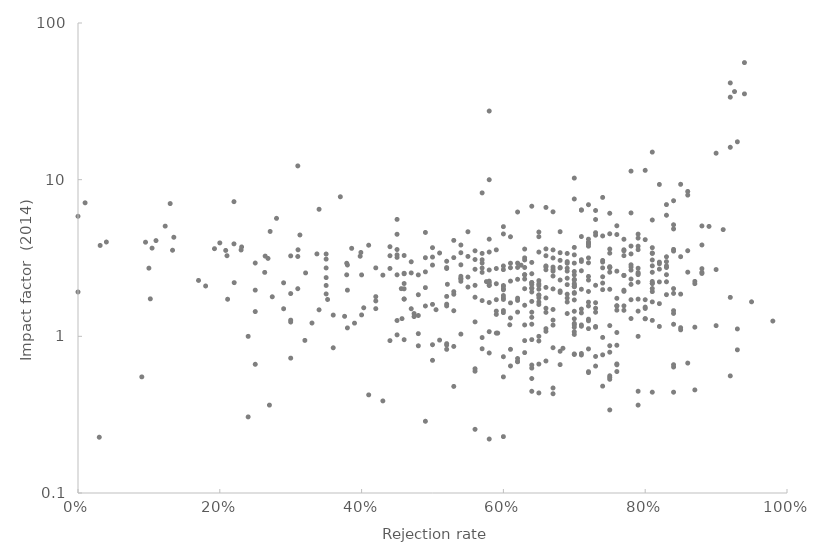
| Category | Series 0 |
|---|---|
| 0.98 | 1.252 |
| 0.95 | 1.661 |
| 0.94 | 35.289 |
| 0.94 | 55.873 |
| 0.93 | 0.82 |
| 0.93 | 17.445 |
| 0.93 | 1.115 |
| 0.926 | 36.503 |
| 0.92 | 1.773 |
| 0.92 | 41.456 |
| 0.92 | 16.095 |
| 0.92 | 33.611 |
| 0.92 | 0.559 |
| 0.91 | 4.799 |
| 0.9 | 2.668 |
| 0.9 | 1.17 |
| 0.9 | 14.756 |
| 0.89 | 5.031 |
| 0.88 | 5.064 |
| 0.88 | 2.704 |
| 0.88 | 3.829 |
| 0.88 | 2.561 |
| 0.88 | 2.519 |
| 0.87 | 1.144 |
| 0.87 | 2.243 |
| 0.87 | 0.455 |
| 0.87 | 2.169 |
| 0.86 | 2.568 |
| 0.86 | 8.41 |
| 0.86 | 3.518 |
| 0.86 | 0.675 |
| 0.86 | 7.972 |
| 0.85 | 1.1 |
| 0.85 | 1.135 |
| 0.85 | 1.86 |
| 0.85 | 9.343 |
| 0.85 | 3.224 |
| 0.84 | 1.4 |
| 0.84 | 4.847 |
| 0.84 | 2.017 |
| 0.84 | 3.59 |
| 0.84 | 0.659 |
| 0.84 | 1.194 |
| 0.84 | 5.153 |
| 0.84 | 0.44 |
| 0.84 | 3.501 |
| 0.84 | 7.338 |
| 0.84 | 1.458 |
| 0.84 | 1.879 |
| 0.84 | 0.637 |
| 0.83 | 6.932 |
| 0.83 | 2.815 |
| 0.83 | 2.749 |
| 0.83 | 2.998 |
| 0.83 | 5.929 |
| 0.83 | 2.474 |
| 0.83 | 2.229 |
| 0.83 | 1.845 |
| 0.83 | 3.22 |
| 0.82 | 1.617 |
| 0.82 | 2.906 |
| 0.82 | 2.685 |
| 0.82 | 9.322 |
| 0.82 | 2.976 |
| 0.82 | 2.225 |
| 0.82 | 1.156 |
| 0.81 | 3.402 |
| 0.81 | 1.264 |
| 0.81 | 2.172 |
| 0.81 | 3.071 |
| 0.81 | 1.929 |
| 0.81 | 3.383 |
| 0.81 | 1.659 |
| 0.81 | 2.818 |
| 0.81 | 3.681 |
| 0.81 | 0.44 |
| 0.81 | 2.02 |
| 0.81 | 15 |
| 0.81 | 2.24 |
| 0.81 | 2.564 |
| 0.81 | 2.182 |
| 0.81 | 5.528 |
| 0.8 | 1.713 |
| 0.8 | 4.141 |
| 0.8 | 1.537 |
| 0.8 | 1.297 |
| 0.8 | 1.506 |
| 0.8 | 11.47 |
| 0.8 | 1.293 |
| 0.79 | 3.762 |
| 0.79 | 4.494 |
| 0.79 | 1.448 |
| 0.79 | 1.728 |
| 0.79 | 2.72 |
| 0.79 | 0.364 |
| 0.79 | 1 |
| 0.79 | 0.446 |
| 0.79 | 2.475 |
| 0.79 | 3.574 |
| 0.79 | 4.237 |
| 0.79 | 2.216 |
| 0.79 | 2.515 |
| 0.79 | 2.554 |
| 0.78 | 2.145 |
| 0.78 | 3.769 |
| 0.78 | 2.322 |
| 0.78 | 1.299 |
| 0.78 | 3.358 |
| 0.78 | 2.862 |
| 0.78 | 1.713 |
| 0.78 | 2.771 |
| 0.78 | 11.336 |
| 0.78 | 6.135 |
| 0.78 | 2.646 |
| 0.77 | 1.97 |
| 0.77 | 1.466 |
| 0.77 | 3.273 |
| 0.77 | 2.451 |
| 0.77 | 1.565 |
| 0.77 | 3.568 |
| 0.77 | 3.512 |
| 0.77 | 2.444 |
| 0.77 | 4.165 |
| 0.77 | 1.936 |
| 0.76 | 4.465 |
| 0.76 | 0.596 |
| 0.76 | 1.562 |
| 0.76 | 0.877 |
| 0.76 | 1.749 |
| 0.76 | 2.606 |
| 0.76 | 1.058 |
| 0.76 | 1.568 |
| 0.76 | 0.658 |
| 0.76 | 5.078 |
| 0.76 | 1.469 |
| 0.76 | 0.667 |
| 0.75 | 6.1 |
| 0.75 | 0.532 |
| 0.75 | 4.513 |
| 0.75 | 1.997 |
| 0.75 | 0.871 |
| 0.75 | 3.395 |
| 0.75 | 2.786 |
| 0.75 | 0.339 |
| 0.75 | 0.792 |
| 0.75 | 1.171 |
| 0.75 | 2.567 |
| 0.75 | 3.607 |
| 0.75 | 0.546 |
| 0.75 | 2.751 |
| 0.75 | 0.56 |
| 0.75 | 2.747 |
| 0.74 | 0.984 |
| 0.74 | 2.4 |
| 0.74 | 4.373 |
| 0.74 | 1.986 |
| 0.74 | 0.481 |
| 0.74 | 3.051 |
| 0.74 | 7.705 |
| 0.74 | 2.979 |
| 0.74 | 2.736 |
| 0.74 | 0.762 |
| 0.74 | 2.188 |
| 0.73 | 0.744 |
| 0.73 | 0.646 |
| 0.73 | 1.639 |
| 0.73 | 4.422 |
| 0.73 | 4.59 |
| 0.73 | 5.567 |
| 0.73 | 1.143 |
| 0.73 | 2.117 |
| 0.73 | 1.425 |
| 0.73 | 6.357 |
| 0.73 | 1.511 |
| 0.73 | 1.156 |
| 0.72 | 3.762 |
| 0.72 | 2.286 |
| 0.72 | 3.871 |
| 0.72 | 3.942 |
| 0.72 | 4.172 |
| 0.72 | 3.973 |
| 0.72 | 1.287 |
| 0.72 | 1.562 |
| 0.72 | 3.169 |
| 0.72 | 1.933 |
| 0.72 | 6.921 |
| 0.72 | 0.587 |
| 0.72 | 2.412 |
| 0.72 | 0.831 |
| 0.72 | 3.957 |
| 0.72 | 2.947 |
| 0.72 | 1.256 |
| 0.72 | 1.653 |
| 0.72 | 0.595 |
| 0.72 | 1.12 |
| 0.71 | 6.409 |
| 0.71 | 1.493 |
| 0.71 | 0.777 |
| 0.71 | 3.005 |
| 0.71 | 3.082 |
| 0.71 | 4.333 |
| 0.71 | 1.182 |
| 0.71 | 1.16 |
| 0.71 | 0.76 |
| 0.71 | 6.393 |
| 0.71 | 2.622 |
| 0.71 | 1.998 |
| 0.71 | 1.411 |
| 0.7 | 1.294 |
| 0.7 | 2.467 |
| 0.7 | 3.694 |
| 0.7 | 1.445 |
| 0.7 | 2.081 |
| 0.7 | 1.209 |
| 0.7 | 0.766 |
| 0.7 | 2.171 |
| 0.7 | 1.182 |
| 0.7 | 2.072 |
| 0.7 | 1.88 |
| 0.7 | 2.284 |
| 0.7 | 2.131 |
| 0.7 | 1.07 |
| 0.7 | 2.594 |
| 0.7 | 0.772 |
| 0.7 | 3.312 |
| 0.7 | 1.142 |
| 0.7 | 2.933 |
| 0.7 | 1.028 |
| 0.7 | 10.235 |
| 0.7 | 7.528 |
| 0.7 | 1.707 |
| 0.7 | 2.308 |
| 0.7 | 1.903 |
| 0.69 | 2.929 |
| 0.69 | 1.656 |
| 0.69 | 2.138 |
| 0.69 | 3.381 |
| 0.69 | 2.999 |
| 0.69 | 2.722 |
| 0.69 | 2.609 |
| 0.69 | 2.349 |
| 0.69 | 1.398 |
| 0.69 | 1.755 |
| 0.69 | 1.858 |
| 0.684 | 0.839 |
| 0.68 | 2.752 |
| 0.68 | 0.66 |
| 0.68 | 1.948 |
| 0.68 | 1.906 |
| 0.68 | 3.419 |
| 0.68 | 2.729 |
| 0.68 | 4.655 |
| 0.68 | 2.288 |
| 0.68 | 3.054 |
| 0.68 | 0.803 |
| 0.67 | 2.007 |
| 0.67 | 0.846 |
| 0.67 | 2.605 |
| 0.67 | 1.269 |
| 0.67 | 6.235 |
| 0.67 | 1.179 |
| 0.67 | 1.484 |
| 0.67 | 0.43 |
| 0.67 | 2.676 |
| 0.67 | 3.562 |
| 0.67 | 3.163 |
| 0.67 | 2.426 |
| 0.67 | 2.768 |
| 0.67 | 0.468 |
| 0.66 | 1.511 |
| 0.66 | 1.076 |
| 0.66 | 0.696 |
| 0.66 | 2.66 |
| 0.66 | 2.772 |
| 0.66 | 3.615 |
| 0.66 | 2.815 |
| 0.66 | 3.269 |
| 0.66 | 1.422 |
| 0.66 | 1.119 |
| 0.66 | 2.053 |
| 0.66 | 6.65 |
| 0.66 | 1.759 |
| 0.65 | 1.657 |
| 0.65 | 2.268 |
| 0.65 | 3.451 |
| 0.65 | 2 |
| 0.65 | 1.761 |
| 0.65 | 4.325 |
| 0.65 | 0.435 |
| 0.65 | 4.632 |
| 0.65 | 0.665 |
| 0.65 | 1 |
| 0.65 | 2.164 |
| 0.65 | 1.83 |
| 0.65 | 0.934 |
| 0.65 | 1.597 |
| 0.65 | 1.838 |
| 0.65 | 2.109 |
| 0.64 | 2.203 |
| 0.64 | 2.963 |
| 0.64 | 2.032 |
| 0.64 | 0.446 |
| 0.64 | 1.919 |
| 0.64 | 2.14 |
| 0.64 | 0.953 |
| 0.64 | 1.195 |
| 0.64 | 2.027 |
| 0.64 | 2.204 |
| 0.64 | 1.322 |
| 0.64 | 1.425 |
| 0.64 | 0.538 |
| 0.64 | 6.767 |
| 0.64 | 2.509 |
| 0.64 | 0.656 |
| 0.64 | 0.627 |
| 0.64 | 1.67 |
| 0.63 | 1.579 |
| 0.63 | 2.321 |
| 0.63 | 2.751 |
| 0.63 | 3.169 |
| 0.63 | 0.787 |
| 0.63 | 1.182 |
| 0.63 | 2.472 |
| 0.63 | 2.474 |
| 0.63 | 0.939 |
| 0.63 | 3.072 |
| 0.63 | 3.606 |
| 0.63 | 2.014 |
| 0.625 | 2.844 |
| 0.62 | 2.934 |
| 0.62 | 2.752 |
| 0.62 | 0.691 |
| 0.62 | 0.688 |
| 0.62 | 2.312 |
| 0.62 | 6.217 |
| 0.62 | 1.753 |
| 0.62 | 1.695 |
| 0.62 | 0.722 |
| 0.62 | 1.428 |
| 0.61 | 1.635 |
| 0.61 | 2.929 |
| 0.61 | 1.31 |
| 0.61 | 2.741 |
| 0.61 | 0.826 |
| 0.61 | 0.647 |
| 0.61 | 2.252 |
| 0.61 | 4.321 |
| 0.609 | 1.185 |
| 0.6 | 4.504 |
| 0.6 | 2.084 |
| 0.6 | 1.759 |
| 0.6 | 0.229 |
| 0.6 | 2.666 |
| 0.6 | 2.11 |
| 0.6 | 1.821 |
| 0.6 | 5.013 |
| 0.6 | 1.981 |
| 0.6 | 2.01 |
| 0.6 | 0.741 |
| 0.6 | 1.417 |
| 0.6 | 2.813 |
| 0.6 | 1.719 |
| 0.6 | 1.461 |
| 0.6 | 0.551 |
| 0.5920000000000001 | 1.049 |
| 0.59 | 2.709 |
| 0.59 | 1.449 |
| 0.59 | 1.049 |
| 0.59 | 3.564 |
| 0.59 | 1.714 |
| 0.59 | 2.167 |
| 0.59 | 1.38 |
| 0.58 | 0.221 |
| 0.58 | 2.252 |
| 0.58 | 2.196 |
| 0.58 | 4.169 |
| 0.58 | 2.128 |
| 0.58 | 1.644 |
| 0.58 | 0.783 |
| 0.58 | 2.651 |
| 0.58 | 3.453 |
| 0.58 | 1.071 |
| 0.58 | 2.11 |
| 0.58 | 27.417 |
| 0.58 | 9.992 |
| 0.5760000000000001 | 2.236 |
| 0.57 | 0.833 |
| 0.57 | 1.691 |
| 0.57 | 3.082 |
| 0.57 | 8.235 |
| 0.57 | 3.383 |
| 0.57 | 2.729 |
| 0.57 | 2.937 |
| 0.57 | 2.561 |
| 0.57 | 0.982 |
| 0.56 | 0.621 |
| 0.56 | 0.255 |
| 0.56 | 1.777 |
| 0.56 | 0.599 |
| 0.56 | 1.237 |
| 0.56 | 2.116 |
| 0.56 | 3.092 |
| 0.56 | 3.516 |
| 0.56 | 2.679 |
| 0.55 | 2.063 |
| 0.55 | 2.39 |
| 0.55 | 3.236 |
| 0.55 | 4.651 |
| 0.54 | 1.033 |
| 0.54 | 2.862 |
| 0.54 | 2.344 |
| 0.54 | 3.417 |
| 0.54 | 2.416 |
| 0.54 | 3.827 |
| 0.54 | 2.245 |
| 0.54 | 2.324 |
| 0.53 | 0.862 |
| 0.53 | 1.856 |
| 0.53 | 0.479 |
| 0.53 | 1.928 |
| 0.53 | 3.18 |
| 0.53 | 4.097 |
| 0.53 | 1.457 |
| 0.521 | 2.149 |
| 0.52 | 0.879 |
| 0.52 | 3.015 |
| 0.52 | 1.563 |
| 0.52 | 2.747 |
| 0.52 | 0.898 |
| 0.52 | 2.71 |
| 0.52 | 1.605 |
| 0.52 | 0.826 |
| 0.52 | 1.798 |
| 0.51 | 0.946 |
| 0.51 | 3.404 |
| 0.505 | 1.479 |
| 0.5 | 3.206 |
| 0.5 | 1.6 |
| 0.5 | 2.85 |
| 0.5 | 0.884 |
| 0.5 | 3.681 |
| 0.5 | 0.703 |
| 0.49 | 0.287 |
| 0.49 | 1.562 |
| 0.49 | 4.604 |
| 0.49 | 2.046 |
| 0.49 | 2.58 |
| 0.49 | 3.176 |
| 0.48 | 1.358 |
| 0.48 | 1.04 |
| 0.48 | 0.87 |
| 0.48 | 2.467 |
| 0.48 | 1.843 |
| 0.474 | 1.398 |
| 0.474 | 1.337 |
| 0.47 | 2.991 |
| 0.47 | 2.54 |
| 0.47 | 1.5 |
| 0.46 | 3.281 |
| 0.46 | 1.727 |
| 0.46 | 2.508 |
| 0.46 | 2.173 |
| 0.46 | 2.526 |
| 0.46 | 0.952 |
| 0.46 | 1.732 |
| 0.46 | 2.011 |
| 0.457 | 1.297 |
| 0.456 | 2.015 |
| 0.45 | 1.022 |
| 0.45 | 2.47 |
| 0.45 | 3.191 |
| 0.45 | 3.313 |
| 0.45 | 4.482 |
| 0.45 | 3.582 |
| 0.45 | 5.578 |
| 0.45 | 1.262 |
| 0.44 | 0.939 |
| 0.44 | 2.712 |
| 0.44 | 3.733 |
| 0.44 | 3.27 |
| 0.43 | 2.458 |
| 0.43 | 0.387 |
| 0.42 | 1.502 |
| 0.42 | 1.683 |
| 0.42 | 2.735 |
| 0.42 | 1.792 |
| 0.41 | 0.423 |
| 0.41 | 3.816 |
| 0.40299999999999997 | 1.521 |
| 0.4 | 1.37 |
| 0.4 | 2.467 |
| 0.39899999999999997 | 3.43 |
| 0.39799999999999996 | 3.246 |
| 0.39 | 1.214 |
| 0.386 | 3.645 |
| 0.38 | 1.132 |
| 0.38 | 2.853 |
| 0.38 | 1.971 |
| 0.379 | 2.47 |
| 0.379 | 2.927 |
| 0.376 | 1.342 |
| 0.37 | 7.776 |
| 0.36 | 1.367 |
| 0.36 | 0.845 |
| 0.35200000000000004 | 1.719 |
| 0.35 | 2.731 |
| 0.35 | 3.111 |
| 0.35 | 1.865 |
| 0.35 | 2.112 |
| 0.35 | 2.371 |
| 0.35 | 3.353 |
| 0.34 | 1.477 |
| 0.34 | 6.472 |
| 0.337 | 3.358 |
| 0.33 | 1.216 |
| 0.321 | 2.54 |
| 0.32 | 0.942 |
| 0.313 | 4.435 |
| 0.3103448275862069 | 3.568 |
| 0.31 | 12.239 |
| 0.31 | 2.014 |
| 0.31 | 3.234 |
| 0.3 | 3.261 |
| 0.3 | 1.234 |
| 0.3 | 0.726 |
| 0.3 | 1.269 |
| 0.3 | 1.875 |
| 0.29 | 1.5 |
| 0.29 | 2.196 |
| 0.28 | 5.664 |
| 0.27399999999999997 | 1.788 |
| 0.271 | 4.673 |
| 0.27 | 0.364 |
| 0.268 | 3.143 |
| 0.264 | 3.252 |
| 0.2633587786259542 | 2.56 |
| 0.25 | 1.972 |
| 0.25 | 1.439 |
| 0.25 | 0.663 |
| 0.25 | 2.938 |
| 0.24 | 0.306 |
| 0.24 | 1 |
| 0.23076923076923078 | 3.719 |
| 0.23 | 3.558 |
| 0.22033898305084745 | 2.201 |
| 0.22 | 3.893 |
| 0.22 | 7.237 |
| 0.21100000000000002 | 1.725 |
| 0.21014492753623187 | 3.27 |
| 0.20833333333333334 | 3.534 |
| 0.2 | 3.948 |
| 0.19248826291079812 | 3.626 |
| 0.18 | 2.096 |
| 0.17 | 2.274 |
| 0.13513513513513514 | 4.289 |
| 0.13333333333333333 | 3.544 |
| 0.13 | 7.037 |
| 0.12300000000000001 | 5.053 |
| 0.11 | 4.084 |
| 0.1044776119402985 | 3.656 |
| 0.102 | 1.735 |
| 0.1 | 2.724 |
| 0.09523809523809523 | 3.989 |
| 0.09 | 0.551 |
| 0.04 | 4 |
| 0.03125 | 3.802 |
| 0.03 | 0.227 |
| 0.01 | 7.117 |
| 0.0 | 1.919 |
| 0.0 | 5.84 |